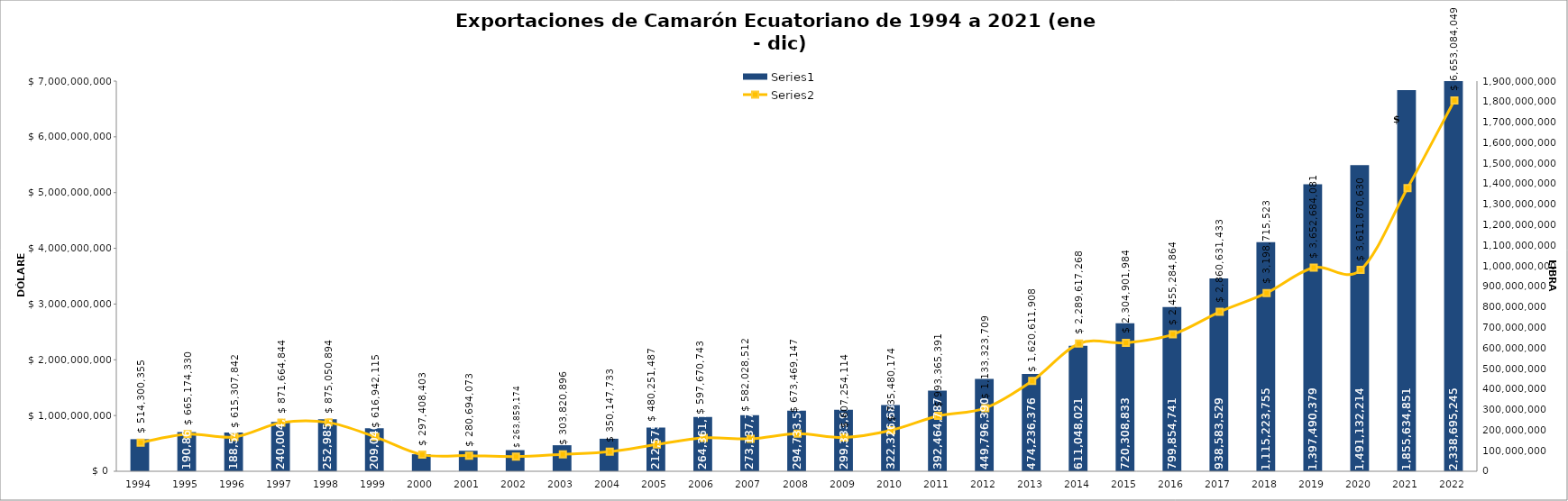
| Category | Series 0 |
|---|---|
| 1994.0 | 156200837 |
| 1995.0 | 190862764 |
| 1996.0 | 188541533 |
| 1997.0 | 240004270 |
| 1998.0 | 252985907 |
| 1999.0 | 209040500 |
| 2000.0 | 82955793 |
| 2001.0 | 99801296 |
| 2002.0 | 103033746 |
| 2003.0 | 126750834 |
| 2004.0 | 158460630 |
| 2005.0 | 212575213 |
| 2006.0 | 264361763 |
| 2007.0 | 273137769 |
| 2008.0 | 294733588 |
| 2009.0 | 299333918 |
| 2010.0 | 322326680 |
| 2011.0 | 392464787 |
| 2012.0 | 449796390 |
| 2013.0 | 474236376 |
| 2014.0 | 611048021 |
| 2015.0 | 720308833 |
| 2016.0 | 799854741 |
| 2017.0 | 938583529 |
| 2018.0 | 1115223755 |
| 2019.0 | 1397490379 |
| 2020.0 | 1491132214 |
| 2021.0 | 1855634851 |
| 2022.0 | 2338695245 |